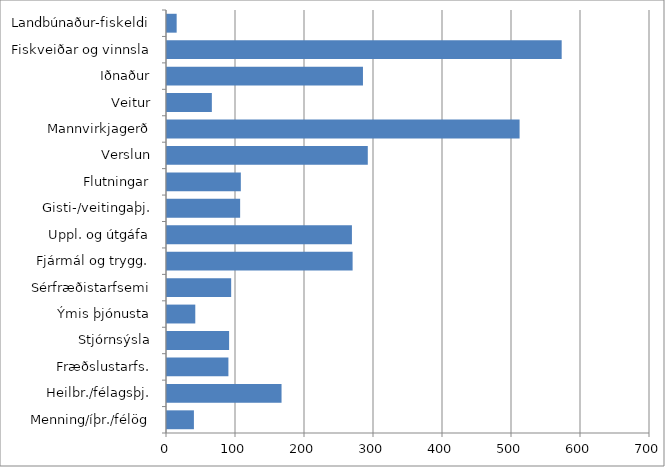
| Category | Series 0 |
|---|---|
| Landbúnaður-fiskeldi | 14 |
| Fiskveiðar og vinnsla | 572 |
| Iðnaður | 284 |
| Veitur | 65 |
| Mannvirkjagerð | 511 |
| Verslun | 291 |
| Flutningar | 107 |
| Gisti-/veitingaþj. | 106 |
| Uppl. og útgáfa | 268 |
| Fjármál og trygg. | 269 |
| Sérfræðistarfsemi | 93 |
| Ýmis þjónusta | 41 |
| Stjórnsýsla | 90 |
| Fræðslustarfs. | 89 |
| Heilbr./félagsþj. | 166 |
| Menning/íþr./félög | 39 |